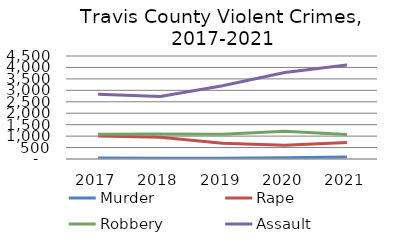
| Category | Murder | Rape | Robbery | Assault |
|---|---|---|---|---|
| 2017.0 | 39 | 1007 | 1083 | 2831 |
| 2018.0 | 38 | 949 | 1096 | 2728 |
| 2019.0 | 35 | 692 | 1085 | 3200 |
| 2020.0 | 53 | 601 | 1209 | 3775 |
| 2021.0 | 91 | 726 | 1073 | 4111 |